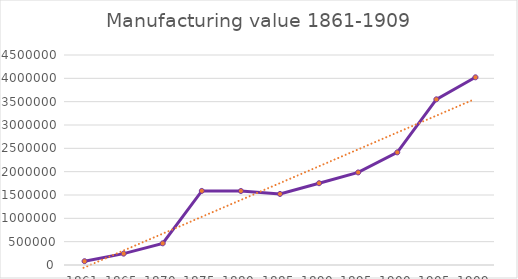
| Category | Series 1 |
|---|---|
| 1861.0 | 81291 |
| 1865.0 | 243007 |
| 1870.0 | 464280 |
| 1875.0 | 1587581 |
| 1880.0 | 1585562 |
| 1885.0 | 1522649 |
| 1890.0 | 1752878 |
| 1895.0 | 1983844 |
| 1900.0 | 2413989 |
| 1905.0 | 3550276 |
| 1909.0 | 4021783 |